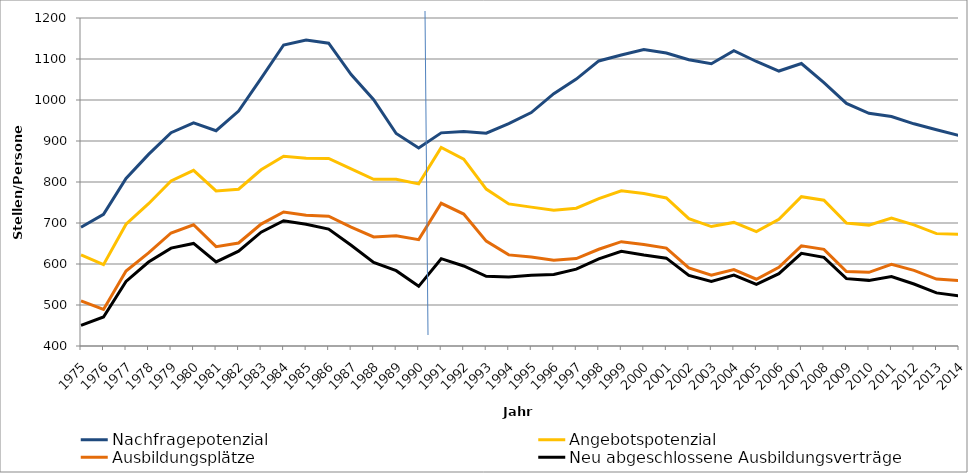
| Category | Nachfragepotenzial | Angebotspotenzial | Ausbildungsplätze | Neu abgeschlossene Ausbildungsverträge |
|---|---|---|---|---|
| 1975.0 | 689.47 | 622.26 | 510.1 | 450.1 |
| 1976.0 | 721.15 | 598.44 | 489 | 470.9 |
| 1977.0 | 808.77 | 696.99 | 583 | 557.5 |
| 1978.0 | 867.42 | 747 | 627 | 604.7 |
| 1979.0 | 920.22 | 802.69 | 675.64 | 638.7 |
| 1980.0 | 944.05 | 828.34 | 695.65 | 650.1 |
| 1981.0 | 925 | 778.11 | 642.35 | 605 |
| 1982.0 | 973.04 | 782.5 | 651.29 | 631.3 |
| 1983.0 | 1052.84 | 829.82 | 697.34 | 677.7 |
| 1984.0 | 1134.07 | 862.78 | 726.73 | 705.6 |
| 1985.0 | 1146.1 | 858.12 | 719.12 | 697.1 |
| 1986.0 | 1138.68 | 857.56 | 716.5 | 685.3 |
| 1987.0 | 1062.06 | 831.93 | 690.2 | 645.7 |
| 1988.0 | 1000.77 | 806.52 | 666 | 604 |
| 1989.0 | 918.36 | 806.92 | 668.64 | 583.74 |
| 1990.0 | 882.95 | 795.42 | 659.45 | 545.55 |
| 1991.0 | 919.88 | 884.22 | 748.07 | 612.97 |
| 1992.0 | 923.32 | 855.89 | 721.81 | 595.21 |
| 1993.0 | 918.91 | 782.64 | 655.82 | 570.12 |
| 1994.0 | 942.43 | 746.6 | 622.27 | 568.17 |
| 1995.0 | 969.37 | 738.69 | 616.97 | 572.77 |
| 1996.0 | 1015.35 | 731.26 | 609.23 | 574.33 |
| 1997.0 | 1050.9 | 736.07 | 613.37 | 587.51 |
| 1998.0 | 1095.29 | 759.59 | 635.93 | 612.53 |
| 1999.0 | 1109.82 | 778.66 | 654.46 | 631.02 |
| 2000.0 | 1123.32 | 771.81 | 647.437 | 621.747 |
| 2001.0 | 1114.76 | 761.13 | 638.768 | 614.233 |
| 2002.0 | 1098.25 | 710.53 | 590.33 | 572.325 |
| 2003.0 | 1088.55 | 691.36 | 572.472 | 557.632 |
| 2004.0 | 1120.2 | 701.42 | 586.374 | 572.98 |
| 2005.0 | 1093.89 | 679.16 | 562.816 | 550.18 |
| 2006.0 | 1070.67 | 709.23 | 591.779 | 576.378 |
| 2007.0 | 1088.92 | 764.15 | 644.244 | 625.885 |
| 2008.0 | 1042.25 | 755.58 | 635.758 | 616.342 |
| 2009.0 | 991.77 | 700.12 | 581.562 | 564.307 |
| 2010.0 | 967.62 | 694.84 | 579.678 | 560.073 |
| 2011.0 | 959.69 | 712.21 | 599.068 | 569.379 |
| 2012.0 | 941.92 | 695.35 | 584.533 | 551.259 |
| 2013.0 | 927.5 | 674.08 | 563.28 | 529.542 |
| 2014.0 | 913.56 | 672.71 | 559.335 | 522.234 |